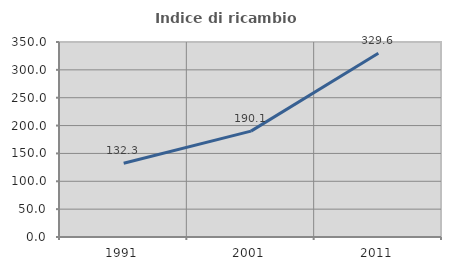
| Category | Indice di ricambio occupazionale  |
|---|---|
| 1991.0 | 132.261 |
| 2001.0 | 190.061 |
| 2011.0 | 329.647 |